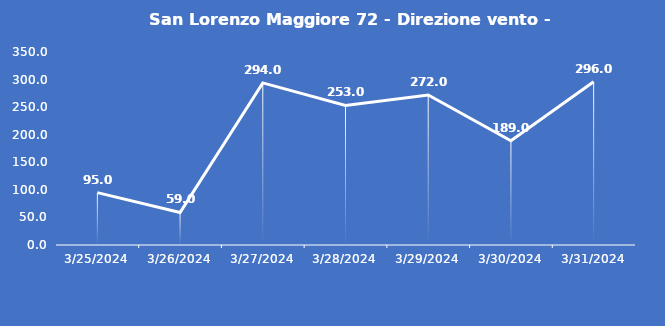
| Category | San Lorenzo Maggiore 72 - Direzione vento - Grezzo (°N) |
|---|---|
| 3/25/24 | 95 |
| 3/26/24 | 59 |
| 3/27/24 | 294 |
| 3/28/24 | 253 |
| 3/29/24 | 272 |
| 3/30/24 | 189 |
| 3/31/24 | 296 |